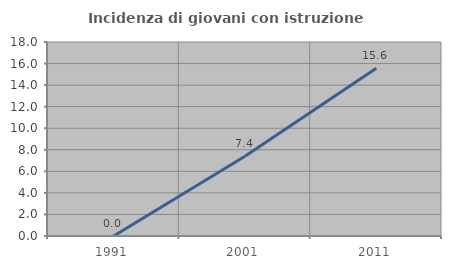
| Category | Incidenza di giovani con istruzione universitaria |
|---|---|
| 1991.0 | 0 |
| 2001.0 | 7.407 |
| 2011.0 | 15.556 |